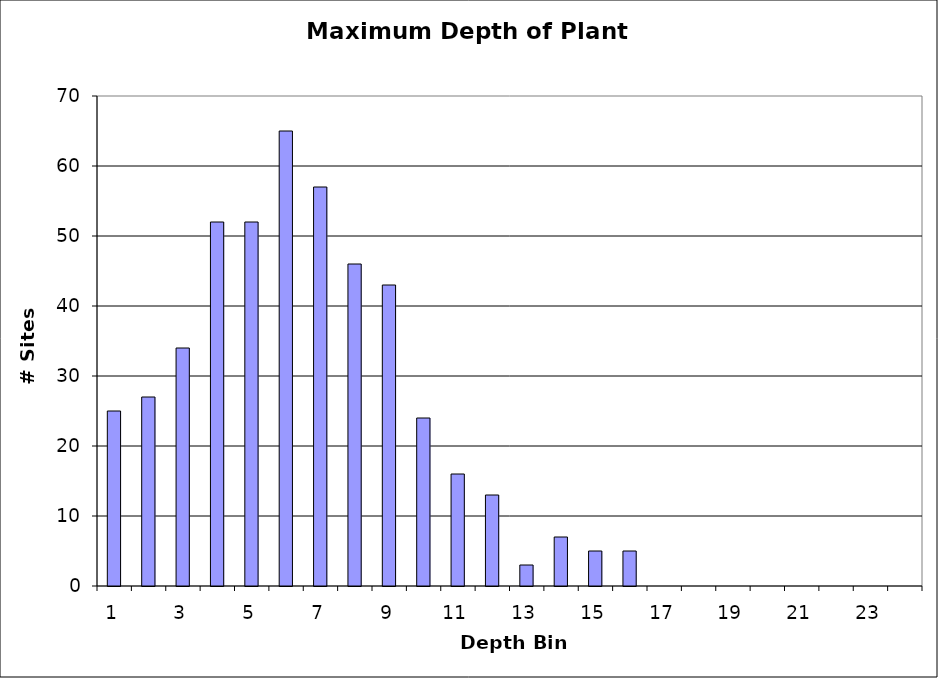
| Category | Series 0 |
|---|---|
| 1.0 | 25 |
| 2.0 | 27 |
| 3.0 | 34 |
| 4.0 | 52 |
| 5.0 | 52 |
| 6.0 | 65 |
| 7.0 | 57 |
| 8.0 | 46 |
| 9.0 | 43 |
| 10.0 | 24 |
| 11.0 | 16 |
| 12.0 | 13 |
| 13.0 | 3 |
| 14.0 | 7 |
| 15.0 | 5 |
| 16.0 | 5 |
| 17.0 | 0 |
| 18.0 | 0 |
| 19.0 | 0 |
| 20.0 | 0 |
| 21.0 | 0 |
| 22.0 | 0 |
| 23.0 | 0 |
| 24.0 | 0 |